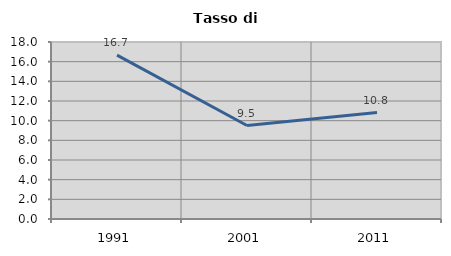
| Category | Tasso di disoccupazione   |
|---|---|
| 1991.0 | 16.667 |
| 2001.0 | 9.506 |
| 2011.0 | 10.823 |